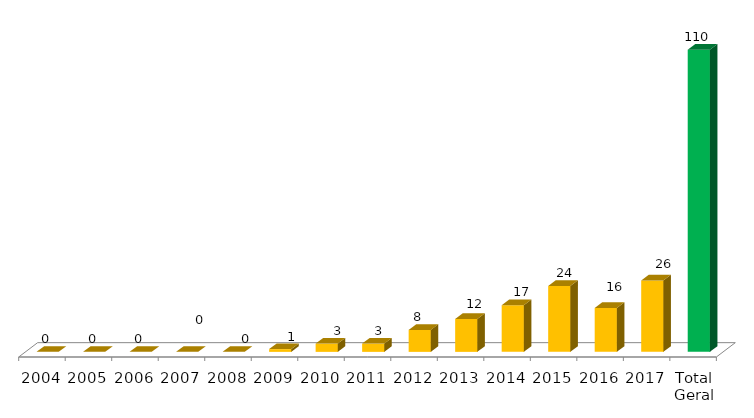
| Category | Categoria/Ano |
|---|---|
| 2004 | 0 |
| 2005 | 0 |
| 2006 | 0 |
| 2007 | 0 |
| 2008 | 0 |
| 2009 | 1 |
| 2010 | 3 |
| 2011 | 3 |
| 2012 | 8 |
| 2013 | 12 |
| 2014 | 17 |
| 2015 | 24 |
| 2016 | 16 |
| 2017 | 26 |
| Total Geral | 110 |